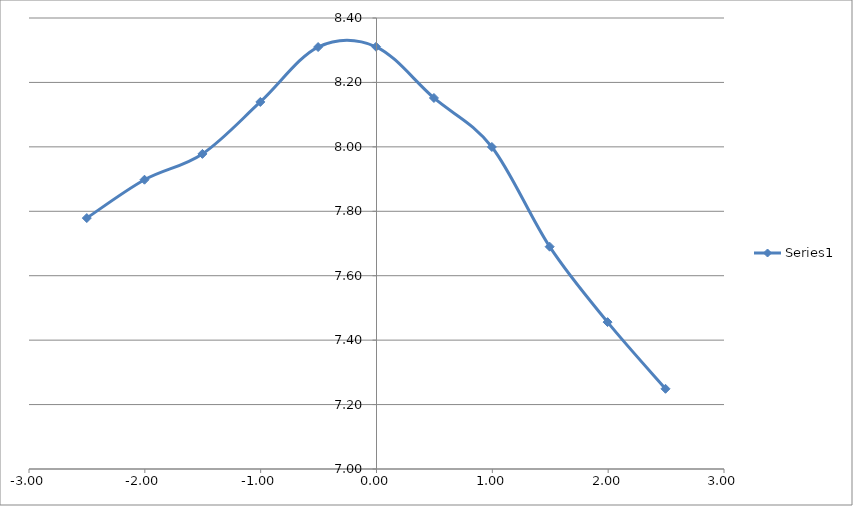
| Category | Series 0 |
|---|---|
| -2.5010000000000003 | 7.779 |
| -2.003 | 7.898 |
| -1.5030000000000001 | 7.978 |
| -1.0030000000000001 | 8.139 |
| -0.5040000000000004 | 8.31 |
| -0.004000000000000448 | 8.311 |
| 0.49599999999999955 | 8.152 |
| 0.9959999999999996 | 8 |
| 1.495 | 7.69 |
| 1.995 | 7.456 |
| 2.495 | 7.249 |